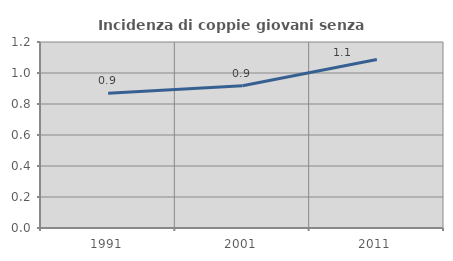
| Category | Incidenza di coppie giovani senza figli |
|---|---|
| 1991.0 | 0.87 |
| 2001.0 | 0.917 |
| 2011.0 | 1.087 |